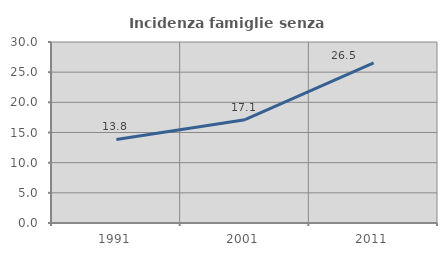
| Category | Incidenza famiglie senza nuclei |
|---|---|
| 1991.0 | 13.849 |
| 2001.0 | 17.126 |
| 2011.0 | 26.547 |